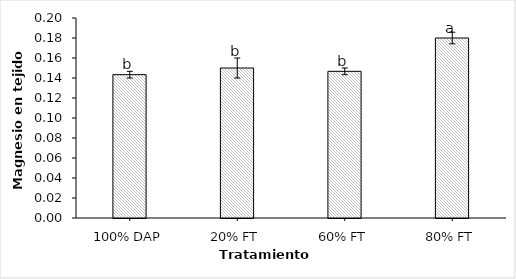
| Category | Mg |
|---|---|
| 100% DAP | 0.143 |
| 20% FT | 0.15 |
| 60% FT | 0.147 |
| 80% FT | 0.18 |